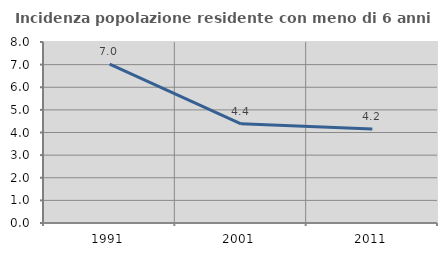
| Category | Incidenza popolazione residente con meno di 6 anni |
|---|---|
| 1991.0 | 7.022 |
| 2001.0 | 4.386 |
| 2011.0 | 4.16 |